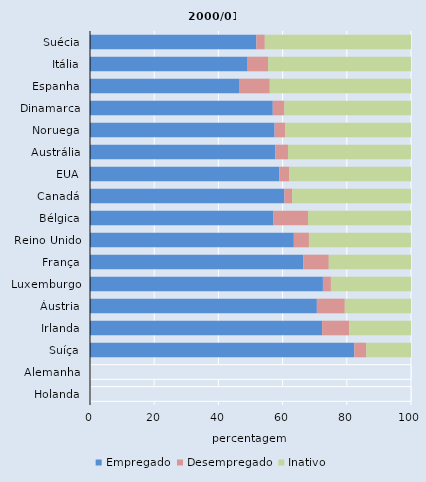
| Category | Empregado | Desempregado | Inativo |
|---|---|---|---|
| Suécia | 51.822 | 2.632 | 45.547 |
| Itália | 48.914 | 6.567 | 44.519 |
| Espanha | 46.612 | 9.397 | 43.991 |
| Dinamarca | 56.94 | 3.628 | 39.432 |
| Noruega | 57.511 | 3.29 | 39.199 |
| Austrália | 57.712 | 3.976 | 38.313 |
| EUA | 58.999 | 3.048 | 37.952 |
| Canadá | 60.573 | 2.397 | 37.03 |
| Bélgica | 57.174 | 10.739 | 32.088 |
| Reino Unido | 63.504 | 4.697 | 31.799 |
| França | 66.488 | 7.899 | 25.612 |
| Luxemburgo | 72.564 | 2.49 | 24.947 |
| Áustria | 70.676 | 8.706 | 20.619 |
| Irlanda | 72.316 | 8.475 | 19.209 |
| Suíça | 82.352 | 3.695 | 13.952 |
| Alemanha | 0 | 100 | 0 |
| Holanda | 0 | 100 | 0 |